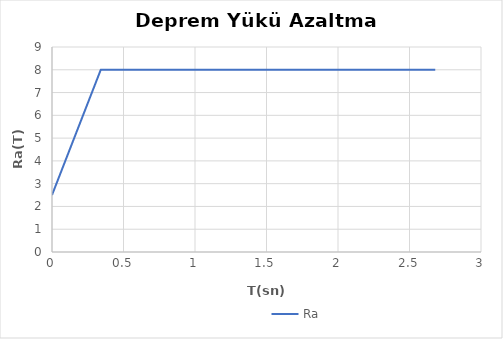
| Category | Ra |
|---|---|
| 0.0 | 2.5 |
| 0.004 | 2.565 |
| 0.008 | 2.629 |
| 0.012 | 2.694 |
| 0.016 | 2.758 |
| 0.02 | 2.823 |
| 0.024 | 2.887 |
| 0.028 | 2.952 |
| 0.032 | 3.016 |
| 0.036000000000000004 | 3.081 |
| 0.04000000000000001 | 3.145 |
| 0.04400000000000001 | 3.21 |
| 0.048000000000000015 | 3.274 |
| 0.05200000000000002 | 3.339 |
| 0.05600000000000002 | 3.403 |
| 0.060000000000000026 | 3.468 |
| 0.06400000000000003 | 3.532 |
| 0.06820486815415822 | 3.6 |
| 0.07200000000000004 | 3.661 |
| 0.07600000000000004 | 3.726 |
| 0.08000000000000004 | 3.79 |
| 0.08400000000000005 | 3.855 |
| 0.08800000000000005 | 3.919 |
| 0.09200000000000005 | 3.984 |
| 0.09600000000000006 | 4.048 |
| 0.10000000000000006 | 4.113 |
| 0.10400000000000006 | 4.177 |
| 0.10800000000000007 | 4.242 |
| 0.11200000000000007 | 4.306 |
| 0.11600000000000008 | 4.371 |
| 0.12000000000000008 | 4.435 |
| 0.12400000000000008 | 4.5 |
| 0.12800000000000009 | 4.564 |
| 0.1320000000000001 | 4.629 |
| 0.1360000000000001 | 4.693 |
| 0.1400000000000001 | 4.758 |
| 0.1440000000000001 | 4.822 |
| 0.1480000000000001 | 4.887 |
| 0.1520000000000001 | 4.951 |
| 0.1560000000000001 | 5.016 |
| 0.16000000000000011 | 5.08 |
| 0.16400000000000012 | 5.145 |
| 0.16800000000000012 | 5.209 |
| 0.17200000000000013 | 5.274 |
| 0.17600000000000013 | 5.339 |
| 0.18000000000000013 | 5.403 |
| 0.18400000000000014 | 5.468 |
| 0.18800000000000014 | 5.532 |
| 0.19200000000000014 | 5.597 |
| 0.19600000000000015 | 5.661 |
| 0.20000000000000015 | 5.726 |
| 0.20400000000000015 | 5.79 |
| 0.20800000000000016 | 5.855 |
| 0.21200000000000016 | 5.919 |
| 0.21600000000000016 | 5.984 |
| 0.22000000000000017 | 6.048 |
| 0.22400000000000017 | 6.113 |
| 0.22800000000000017 | 6.177 |
| 0.23200000000000018 | 6.242 |
| 0.23600000000000018 | 6.306 |
| 0.24000000000000019 | 6.371 |
| 0.2440000000000002 | 6.435 |
| 0.2480000000000002 | 6.5 |
| 0.25200000000000017 | 6.564 |
| 0.25600000000000017 | 6.629 |
| 0.2600000000000002 | 6.693 |
| 0.2640000000000002 | 6.758 |
| 0.2680000000000002 | 6.822 |
| 0.2720000000000002 | 6.887 |
| 0.2760000000000002 | 6.951 |
| 0.2800000000000002 | 7.016 |
| 0.2840000000000002 | 7.08 |
| 0.2880000000000002 | 7.145 |
| 0.2920000000000002 | 7.209 |
| 0.2960000000000002 | 7.274 |
| 0.3000000000000002 | 7.338 |
| 0.3040000000000002 | 7.403 |
| 0.3080000000000002 | 7.467 |
| 0.3120000000000002 | 7.532 |
| 0.3160000000000002 | 7.596 |
| 0.32000000000000023 | 7.661 |
| 0.32400000000000023 | 7.725 |
| 0.32800000000000024 | 7.79 |
| 0.33200000000000024 | 7.854 |
| 0.33600000000000024 | 7.919 |
| 0.3410243407707911 | 8 |
| 0.34400000000000025 | 8 |
| 0.34800000000000025 | 8 |
| 0.35200000000000026 | 8 |
| 0.35600000000000026 | 8 |
| 0.36000000000000026 | 8 |
| 0.36400000000000027 | 8 |
| 0.36800000000000027 | 8 |
| 0.3720000000000003 | 8 |
| 0.3760000000000003 | 8 |
| 0.3800000000000003 | 8 |
| 0.3840000000000003 | 8 |
| 0.3880000000000003 | 8 |
| 0.3920000000000003 | 8 |
| 0.3960000000000003 | 8 |
| 0.4000000000000003 | 8 |
| 0.4040000000000003 | 8 |
| 0.4080000000000003 | 8 |
| 0.4120000000000003 | 8 |
| 0.4160000000000003 | 8 |
| 0.4200000000000003 | 8 |
| 0.4240000000000003 | 8 |
| 0.4280000000000003 | 8 |
| 0.43200000000000033 | 8 |
| 0.43600000000000033 | 8 |
| 0.44000000000000034 | 8 |
| 0.44400000000000034 | 8 |
| 0.44800000000000034 | 8 |
| 0.45200000000000035 | 8 |
| 0.45600000000000035 | 8 |
| 0.46000000000000035 | 8 |
| 0.46400000000000036 | 8 |
| 0.46800000000000036 | 8 |
| 0.47200000000000036 | 8 |
| 0.47600000000000037 | 8 |
| 0.48000000000000037 | 8 |
| 0.4840000000000004 | 8 |
| 0.4880000000000004 | 8 |
| 0.4920000000000004 | 8 |
| 0.4960000000000004 | 8 |
| 0.5000000000000003 | 8 |
| 0.5040000000000003 | 8 |
| 0.5080000000000003 | 8 |
| 0.5120000000000003 | 8 |
| 0.5160000000000003 | 8 |
| 0.5200000000000004 | 8 |
| 0.5240000000000004 | 8 |
| 0.5280000000000004 | 8 |
| 0.5320000000000004 | 8 |
| 0.5360000000000004 | 8 |
| 0.5400000000000004 | 8 |
| 0.5440000000000004 | 8 |
| 0.5480000000000004 | 8 |
| 0.5520000000000004 | 8 |
| 0.5560000000000004 | 8 |
| 0.5600000000000004 | 8 |
| 0.5640000000000004 | 8 |
| 0.5680000000000004 | 8 |
| 0.5720000000000004 | 8 |
| 0.5760000000000004 | 8 |
| 0.5800000000000004 | 8 |
| 0.5840000000000004 | 8 |
| 0.5880000000000004 | 8 |
| 0.5920000000000004 | 8 |
| 0.5960000000000004 | 8 |
| 0.6000000000000004 | 8 |
| 0.6040000000000004 | 8 |
| 0.6080000000000004 | 8 |
| 0.6120000000000004 | 8 |
| 0.6160000000000004 | 8 |
| 0.6200000000000004 | 8 |
| 0.6240000000000004 | 8 |
| 0.6280000000000004 | 8 |
| 0.6320000000000005 | 8 |
| 0.6360000000000005 | 8 |
| 0.6400000000000005 | 8 |
| 0.6440000000000005 | 8 |
| 0.6480000000000005 | 8 |
| 0.6520000000000005 | 8 |
| 0.6560000000000005 | 8 |
| 0.6600000000000005 | 8 |
| 0.6640000000000005 | 8 |
| 0.6680000000000005 | 8 |
| 0.6720000000000005 | 8 |
| 0.6760000000000005 | 8 |
| 0.6800000000000005 | 8 |
| 0.6840000000000005 | 8 |
| 0.6880000000000005 | 8 |
| 0.6920000000000005 | 8 |
| 0.6960000000000005 | 8 |
| 0.7000000000000005 | 8 |
| 0.7040000000000005 | 8 |
| 0.7080000000000005 | 8 |
| 0.7120000000000005 | 8 |
| 0.7160000000000005 | 8 |
| 0.7200000000000005 | 8 |
| 0.7240000000000005 | 8 |
| 0.7280000000000005 | 8 |
| 0.7320000000000005 | 8 |
| 0.7360000000000005 | 8 |
| 0.7400000000000005 | 8 |
| 0.7440000000000005 | 8 |
| 0.7480000000000006 | 8 |
| 0.7520000000000006 | 8 |
| 0.7560000000000006 | 8 |
| 0.7600000000000006 | 8 |
| 0.7640000000000006 | 8 |
| 0.7680000000000006 | 8 |
| 0.7720000000000006 | 8 |
| 0.7760000000000006 | 8 |
| 0.7800000000000006 | 8 |
| 0.7840000000000006 | 8 |
| 0.7880000000000006 | 8 |
| 0.7920000000000006 | 8 |
| 0.7960000000000006 | 8 |
| 0.8000000000000006 | 8 |
| 0.8040000000000006 | 8 |
| 0.8080000000000006 | 8 |
| 0.8120000000000006 | 8 |
| 0.8160000000000006 | 8 |
| 0.8200000000000006 | 8 |
| 0.8240000000000006 | 8 |
| 0.8280000000000006 | 8 |
| 0.8320000000000006 | 8 |
| 0.8360000000000006 | 8 |
| 0.8400000000000006 | 8 |
| 0.8440000000000006 | 8 |
| 0.8480000000000006 | 8 |
| 0.8520000000000006 | 8 |
| 0.8560000000000006 | 8 |
| 0.8600000000000007 | 8 |
| 0.8640000000000007 | 8 |
| 0.8680000000000007 | 8 |
| 0.8720000000000007 | 8 |
| 0.8760000000000007 | 8 |
| 0.8800000000000007 | 8 |
| 0.8840000000000007 | 8 |
| 0.8880000000000007 | 8 |
| 0.8920000000000007 | 8 |
| 0.8960000000000007 | 8 |
| 0.9000000000000007 | 8 |
| 0.9040000000000007 | 8 |
| 0.9080000000000007 | 8 |
| 0.9120000000000007 | 8 |
| 0.9160000000000007 | 8 |
| 0.9200000000000007 | 8 |
| 0.9240000000000007 | 8 |
| 0.9280000000000007 | 8 |
| 0.9320000000000007 | 8 |
| 0.9360000000000007 | 8 |
| 0.9400000000000007 | 8 |
| 0.9440000000000007 | 8 |
| 0.9480000000000007 | 8 |
| 0.9520000000000007 | 8 |
| 0.9560000000000007 | 8 |
| 0.9600000000000007 | 8 |
| 0.9640000000000007 | 8 |
| 0.9680000000000007 | 8 |
| 0.9720000000000008 | 8 |
| 0.9760000000000008 | 8 |
| 0.9800000000000008 | 8 |
| 0.9840000000000008 | 8 |
| 0.9880000000000008 | 8 |
| 0.9920000000000008 | 8 |
| 0.9960000000000008 | 8 |
| 1.0 | 8 |
| 1.0040000000000007 | 8 |
| 1.0080000000000007 | 8 |
| 1.0120000000000007 | 8 |
| 1.0160000000000007 | 8 |
| 1.0200000000000007 | 8 |
| 1.0240000000000007 | 8 |
| 1.0280000000000007 | 8 |
| 1.0320000000000007 | 8 |
| 1.0360000000000007 | 8 |
| 1.0400000000000007 | 8 |
| 1.0440000000000007 | 8 |
| 1.0480000000000007 | 8 |
| 1.0520000000000007 | 8 |
| 1.0560000000000007 | 8 |
| 1.0600000000000007 | 8 |
| 1.0640000000000007 | 8 |
| 1.0680000000000007 | 8 |
| 1.0720000000000007 | 8 |
| 1.0760000000000007 | 8 |
| 1.0800000000000007 | 8 |
| 1.0840000000000007 | 8 |
| 1.0880000000000007 | 8 |
| 1.0920000000000007 | 8 |
| 1.0960000000000008 | 8 |
| 1.1000000000000008 | 8 |
| 1.1040000000000008 | 8 |
| 1.1080000000000008 | 8 |
| 1.1120000000000008 | 8 |
| 1.1160000000000008 | 8 |
| 1.1200000000000008 | 8 |
| 1.1240000000000008 | 8 |
| 1.1280000000000008 | 8 |
| 1.1320000000000008 | 8 |
| 1.1360000000000008 | 8 |
| 1.1400000000000008 | 8 |
| 1.1440000000000008 | 8 |
| 1.1480000000000008 | 8 |
| 1.1520000000000008 | 8 |
| 1.1560000000000008 | 8 |
| 1.1600000000000008 | 8 |
| 1.1640000000000008 | 8 |
| 1.1680000000000008 | 8 |
| 1.1720000000000008 | 8 |
| 1.1760000000000008 | 8 |
| 1.1800000000000008 | 8 |
| 1.1840000000000008 | 8 |
| 1.1880000000000008 | 8 |
| 1.1920000000000008 | 8 |
| 1.1960000000000008 | 8 |
| 1.2000000000000008 | 8 |
| 1.2040000000000008 | 8 |
| 1.2080000000000009 | 8 |
| 1.2120000000000009 | 8 |
| 1.2160000000000009 | 8 |
| 1.2200000000000009 | 8 |
| 1.2240000000000009 | 8 |
| 1.2280000000000009 | 8 |
| 1.2320000000000009 | 8 |
| 1.2360000000000009 | 8 |
| 1.2400000000000009 | 8 |
| 1.2440000000000009 | 8 |
| 1.2480000000000009 | 8 |
| 1.252000000000001 | 8 |
| 1.256000000000001 | 8 |
| 1.260000000000001 | 8 |
| 1.264000000000001 | 8 |
| 1.268000000000001 | 8 |
| 1.272000000000001 | 8 |
| 1.276000000000001 | 8 |
| 1.280000000000001 | 8 |
| 1.284000000000001 | 8 |
| 1.288000000000001 | 8 |
| 1.292000000000001 | 8 |
| 1.296000000000001 | 8 |
| 1.300000000000001 | 8 |
| 1.304000000000001 | 8 |
| 1.308000000000001 | 8 |
| 1.312000000000001 | 8 |
| 1.316000000000001 | 8 |
| 1.320000000000001 | 8 |
| 1.324000000000001 | 8 |
| 1.328000000000001 | 8 |
| 1.332000000000001 | 8 |
| 1.336000000000001 | 8 |
| 1.340000000000001 | 8 |
| 1.344000000000001 | 8 |
| 1.348000000000001 | 8 |
| 1.352000000000001 | 8 |
| 1.356000000000001 | 8 |
| 1.360000000000001 | 8 |
| 1.364000000000001 | 8 |
| 1.368000000000001 | 8 |
| 1.372000000000001 | 8 |
| 1.376000000000001 | 8 |
| 1.380000000000001 | 8 |
| 1.384000000000001 | 8 |
| 1.388000000000001 | 8 |
| 1.392000000000001 | 8 |
| 1.396000000000001 | 8 |
| 1.400000000000001 | 8 |
| 1.404000000000001 | 8 |
| 1.408000000000001 | 8 |
| 1.412000000000001 | 8 |
| 1.416000000000001 | 8 |
| 1.420000000000001 | 8 |
| 1.424000000000001 | 8 |
| 1.428000000000001 | 8 |
| 1.432000000000001 | 8 |
| 1.436000000000001 | 8 |
| 1.440000000000001 | 8 |
| 1.444000000000001 | 8 |
| 1.448000000000001 | 8 |
| 1.452000000000001 | 8 |
| 1.456000000000001 | 8 |
| 1.460000000000001 | 8 |
| 1.464000000000001 | 8 |
| 1.468000000000001 | 8 |
| 1.472000000000001 | 8 |
| 1.476000000000001 | 8 |
| 1.480000000000001 | 8 |
| 1.484000000000001 | 8 |
| 1.488000000000001 | 8 |
| 1.492000000000001 | 8 |
| 1.496000000000001 | 8 |
| 1.500000000000001 | 8 |
| 1.5040000000000011 | 8 |
| 1.5080000000000011 | 8 |
| 1.5120000000000011 | 8 |
| 1.5160000000000011 | 8 |
| 1.5200000000000011 | 8 |
| 1.5240000000000011 | 8 |
| 1.5280000000000011 | 8 |
| 1.5320000000000011 | 8 |
| 1.5360000000000011 | 8 |
| 1.5400000000000011 | 8 |
| 1.5440000000000011 | 8 |
| 1.5480000000000012 | 8 |
| 1.5520000000000012 | 8 |
| 1.5560000000000012 | 8 |
| 1.5600000000000012 | 8 |
| 1.5640000000000012 | 8 |
| 1.5680000000000012 | 8 |
| 1.5720000000000012 | 8 |
| 1.5760000000000012 | 8 |
| 1.5800000000000012 | 8 |
| 1.5840000000000012 | 8 |
| 1.5880000000000012 | 8 |
| 1.5920000000000012 | 8 |
| 1.5960000000000012 | 8 |
| 1.6000000000000012 | 8 |
| 1.6040000000000012 | 8 |
| 1.6080000000000012 | 8 |
| 1.6120000000000012 | 8 |
| 1.6160000000000012 | 8 |
| 1.6200000000000012 | 8 |
| 1.6240000000000012 | 8 |
| 1.6280000000000012 | 8 |
| 1.6320000000000012 | 8 |
| 1.6360000000000012 | 8 |
| 1.6400000000000012 | 8 |
| 1.6440000000000012 | 8 |
| 1.6480000000000012 | 8 |
| 1.6520000000000012 | 8 |
| 1.6560000000000012 | 8 |
| 1.6600000000000013 | 8 |
| 1.6640000000000013 | 8 |
| 1.6680000000000013 | 8 |
| 1.6720000000000013 | 8 |
| 1.6760000000000013 | 8 |
| 1.6800000000000013 | 8 |
| 1.6840000000000013 | 8 |
| 1.6880000000000013 | 8 |
| 1.6920000000000013 | 8 |
| 1.6960000000000013 | 8 |
| 1.7000000000000013 | 8 |
| 1.7040000000000013 | 8 |
| 1.7080000000000013 | 8 |
| 1.7120000000000013 | 8 |
| 1.7160000000000013 | 8 |
| 1.7200000000000013 | 8 |
| 1.7240000000000013 | 8 |
| 1.7280000000000013 | 8 |
| 1.7320000000000013 | 8 |
| 1.7360000000000013 | 8 |
| 1.7400000000000013 | 8 |
| 1.7440000000000013 | 8 |
| 1.7480000000000013 | 8 |
| 1.7520000000000013 | 8 |
| 1.7560000000000013 | 8 |
| 1.7600000000000013 | 8 |
| 1.7640000000000013 | 8 |
| 1.7680000000000013 | 8 |
| 1.7720000000000014 | 8 |
| 1.7760000000000014 | 8 |
| 1.7800000000000014 | 8 |
| 1.7840000000000014 | 8 |
| 1.7880000000000014 | 8 |
| 1.7920000000000014 | 8 |
| 1.7960000000000014 | 8 |
| 1.8000000000000014 | 8 |
| 1.8040000000000014 | 8 |
| 1.8080000000000014 | 8 |
| 1.8120000000000014 | 8 |
| 1.8160000000000014 | 8 |
| 1.8200000000000014 | 8 |
| 1.8240000000000014 | 8 |
| 1.8280000000000014 | 8 |
| 1.8320000000000014 | 8 |
| 1.8360000000000014 | 8 |
| 1.8400000000000014 | 8 |
| 1.8440000000000014 | 8 |
| 1.8480000000000014 | 8 |
| 1.8520000000000014 | 8 |
| 1.8560000000000014 | 8 |
| 1.8600000000000014 | 8 |
| 1.8640000000000014 | 8 |
| 1.8680000000000014 | 8 |
| 1.8720000000000014 | 8 |
| 1.8760000000000014 | 8 |
| 1.8800000000000014 | 8 |
| 1.8840000000000015 | 8 |
| 1.8880000000000015 | 8 |
| 1.8920000000000015 | 8 |
| 1.8960000000000015 | 8 |
| 1.9000000000000015 | 8 |
| 1.9040000000000015 | 8 |
| 1.9080000000000015 | 8 |
| 1.9120000000000015 | 8 |
| 1.9160000000000015 | 8 |
| 1.9200000000000015 | 8 |
| 1.9240000000000015 | 8 |
| 1.9280000000000015 | 8 |
| 1.9320000000000015 | 8 |
| 1.9360000000000015 | 8 |
| 1.9400000000000015 | 8 |
| 1.9440000000000015 | 8 |
| 1.9480000000000015 | 8 |
| 1.9520000000000015 | 8 |
| 1.9560000000000015 | 8 |
| 1.9600000000000015 | 8 |
| 1.9640000000000015 | 8 |
| 1.9680000000000015 | 8 |
| 1.9720000000000015 | 8 |
| 1.9760000000000015 | 8 |
| 1.9800000000000015 | 8 |
| 1.9840000000000015 | 8 |
| 1.9880000000000015 | 8 |
| 1.9920000000000015 | 8 |
| 1.9960000000000016 | 8 |
| 2.0000000000000013 | 8 |
| 2.0040000000000013 | 8 |
| 2.0080000000000013 | 8 |
| 2.0120000000000013 | 8 |
| 2.0160000000000013 | 8 |
| 2.0200000000000014 | 8 |
| 2.0240000000000014 | 8 |
| 2.0280000000000014 | 8 |
| 2.0320000000000014 | 8 |
| 2.0360000000000014 | 8 |
| 2.0400000000000014 | 8 |
| 2.0440000000000014 | 8 |
| 2.0480000000000014 | 8 |
| 2.0520000000000014 | 8 |
| 2.0560000000000014 | 8 |
| 2.0600000000000014 | 8 |
| 2.0640000000000014 | 8 |
| 2.0680000000000014 | 8 |
| 2.0720000000000014 | 8 |
| 2.0760000000000014 | 8 |
| 2.0800000000000014 | 8 |
| 2.0840000000000014 | 8 |
| 2.0880000000000014 | 8 |
| 2.0920000000000014 | 8 |
| 2.0960000000000014 | 8 |
| 2.1000000000000014 | 8 |
| 2.1040000000000014 | 8 |
| 2.1080000000000014 | 8 |
| 2.1120000000000014 | 8 |
| 2.1160000000000014 | 8 |
| 2.1200000000000014 | 8 |
| 2.1240000000000014 | 8 |
| 2.1280000000000014 | 8 |
| 2.1320000000000014 | 8 |
| 2.1360000000000015 | 8 |
| 2.1400000000000015 | 8 |
| 2.1440000000000015 | 8 |
| 2.1480000000000015 | 8 |
| 2.1520000000000015 | 8 |
| 2.1560000000000015 | 8 |
| 2.1600000000000015 | 8 |
| 2.1640000000000015 | 8 |
| 2.1680000000000015 | 8 |
| 2.1720000000000015 | 8 |
| 2.1760000000000015 | 8 |
| 2.1800000000000015 | 8 |
| 2.1840000000000015 | 8 |
| 2.1880000000000015 | 8 |
| 2.1920000000000015 | 8 |
| 2.1960000000000015 | 8 |
| 2.2000000000000015 | 8 |
| 2.2040000000000015 | 8 |
| 2.2080000000000015 | 8 |
| 2.2120000000000015 | 8 |
| 2.2160000000000015 | 8 |
| 2.2200000000000015 | 8 |
| 2.2240000000000015 | 8 |
| 2.2280000000000015 | 8 |
| 2.2320000000000015 | 8 |
| 2.2360000000000015 | 8 |
| 2.2400000000000015 | 8 |
| 2.2440000000000015 | 8 |
| 2.2480000000000016 | 8 |
| 2.2520000000000016 | 8 |
| 2.2560000000000016 | 8 |
| 2.2600000000000016 | 8 |
| 2.2640000000000016 | 8 |
| 2.2680000000000016 | 8 |
| 2.2720000000000016 | 8 |
| 2.2760000000000016 | 8 |
| 2.2800000000000016 | 8 |
| 2.2840000000000016 | 8 |
| 2.2880000000000016 | 8 |
| 2.2920000000000016 | 8 |
| 2.2960000000000016 | 8 |
| 2.3000000000000016 | 8 |
| 2.3040000000000016 | 8 |
| 2.3080000000000016 | 8 |
| 2.3120000000000016 | 8 |
| 2.3160000000000016 | 8 |
| 2.3200000000000016 | 8 |
| 2.3240000000000016 | 8 |
| 2.3280000000000016 | 8 |
| 2.3320000000000016 | 8 |
| 2.3360000000000016 | 8 |
| 2.3400000000000016 | 8 |
| 2.3440000000000016 | 8 |
| 2.3480000000000016 | 8 |
| 2.3520000000000016 | 8 |
| 2.3560000000000016 | 8 |
| 2.3600000000000017 | 8 |
| 2.3640000000000017 | 8 |
| 2.3680000000000017 | 8 |
| 2.3720000000000017 | 8 |
| 2.3760000000000017 | 8 |
| 2.3800000000000017 | 8 |
| 2.3840000000000017 | 8 |
| 2.3880000000000017 | 8 |
| 2.3920000000000017 | 8 |
| 2.3960000000000017 | 8 |
| 2.4000000000000017 | 8 |
| 2.4040000000000017 | 8 |
| 2.4080000000000017 | 8 |
| 2.4120000000000017 | 8 |
| 2.4160000000000017 | 8 |
| 2.4200000000000017 | 8 |
| 2.4240000000000017 | 8 |
| 2.4280000000000017 | 8 |
| 2.4320000000000017 | 8 |
| 2.4360000000000017 | 8 |
| 2.4400000000000017 | 8 |
| 2.4440000000000017 | 8 |
| 2.4480000000000017 | 8 |
| 2.4520000000000017 | 8 |
| 2.4560000000000017 | 8 |
| 2.4600000000000017 | 8 |
| 2.4640000000000017 | 8 |
| 2.4680000000000017 | 8 |
| 2.4720000000000018 | 8 |
| 2.4760000000000018 | 8 |
| 2.4800000000000018 | 8 |
| 2.4840000000000018 | 8 |
| 2.4880000000000018 | 8 |
| 2.4920000000000018 | 8 |
| 2.4960000000000018 | 8 |
| 2.5000000000000018 | 8 |
| 2.504000000000002 | 8 |
| 2.508000000000002 | 8 |
| 2.512000000000002 | 8 |
| 2.516000000000002 | 8 |
| 2.520000000000002 | 8 |
| 2.524000000000002 | 8 |
| 2.528000000000002 | 8 |
| 2.532000000000002 | 8 |
| 2.536000000000002 | 8 |
| 2.540000000000002 | 8 |
| 2.544000000000002 | 8 |
| 2.548000000000002 | 8 |
| 2.552000000000002 | 8 |
| 2.556000000000002 | 8 |
| 2.560000000000002 | 8 |
| 2.564000000000002 | 8 |
| 2.568000000000002 | 8 |
| 2.572000000000002 | 8 |
| 2.576000000000002 | 8 |
| 2.580000000000002 | 8 |
| 2.584000000000002 | 8 |
| 2.588000000000002 | 8 |
| 2.592000000000002 | 8 |
| 2.596000000000002 | 8 |
| 2.600000000000002 | 8 |
| 2.604000000000002 | 8 |
| 2.608000000000002 | 8 |
| 2.612000000000002 | 8 |
| 2.616000000000002 | 8 |
| 2.620000000000002 | 8 |
| 2.624000000000002 | 8 |
| 2.628000000000002 | 8 |
| 2.632000000000002 | 8 |
| 2.636000000000002 | 8 |
| 2.640000000000002 | 8 |
| 2.644000000000002 | 8 |
| 2.648000000000002 | 8 |
| 2.652000000000002 | 8 |
| 2.656000000000002 | 8 |
| 2.660000000000002 | 8 |
| 2.664000000000002 | 8 |
| 2.668000000000002 | 8 |
| 2.672000000000002 | 8 |
| 2.676000000000002 | 8 |
| 2.680000000000002 | 8 |